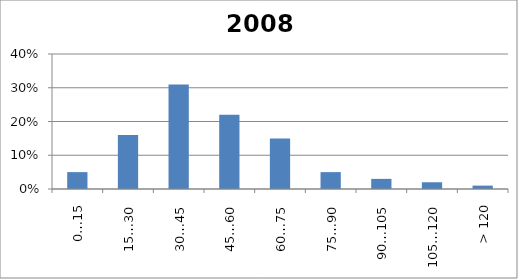
| Category | 2008 |
|---|---|
| 0…15 | 0.05 |
| 15…30 | 0.16 |
| 30…45 | 0.31 |
| 45…60 | 0.22 |
| 60…75 | 0.15 |
| 75…90 | 0.05 |
| 90…105 | 0.03 |
| 105…120 | 0.02 |
| > 120 | 0.01 |